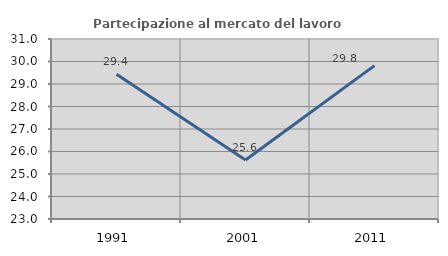
| Category | Partecipazione al mercato del lavoro  femminile |
|---|---|
| 1991.0 | 29.435 |
| 2001.0 | 25.62 |
| 2011.0 | 29.817 |